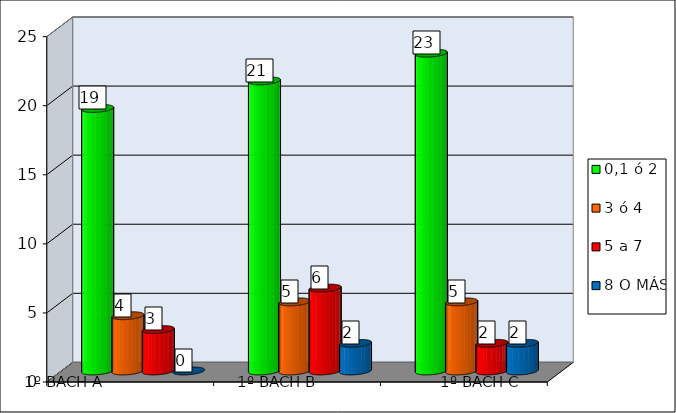
| Category | 0,1 ó 2  | 3 ó 4 | 5 a 7 | 8 O MÁS |
|---|---|---|---|---|
|  | 19 | 4 | 3 | 0 |
|  | 21 | 5 | 6 | 2 |
|  | 23 | 5 | 2 | 2 |